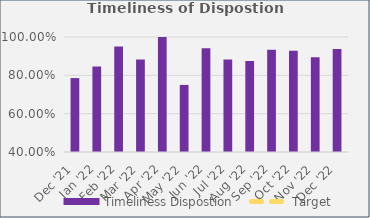
| Category | Timeliness Dispostion |
|---|---|
| Dec '21 | 0.786 |
| Jan '22 | 0.846 |
| Feb '22 | 0.95 |
| Mar '22 | 0.882 |
| Apr '22 | 1 |
| May '22 | 0.75 |
| Jun '22 | 0.941 |
| Jul '22 | 0.882 |
| Aug '22 | 0.875 |
| Sep '22 | 0.933 |
| Oct '22 | 0.929 |
| Nov '22 | 0.895 |
| Dec '22 | 0.938 |